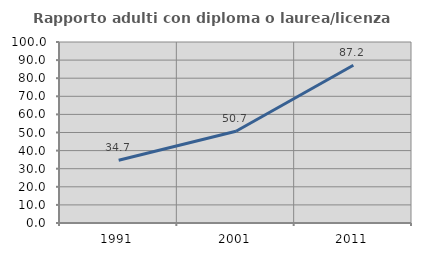
| Category | Rapporto adulti con diploma o laurea/licenza media  |
|---|---|
| 1991.0 | 34.694 |
| 2001.0 | 50.704 |
| 2011.0 | 87.179 |